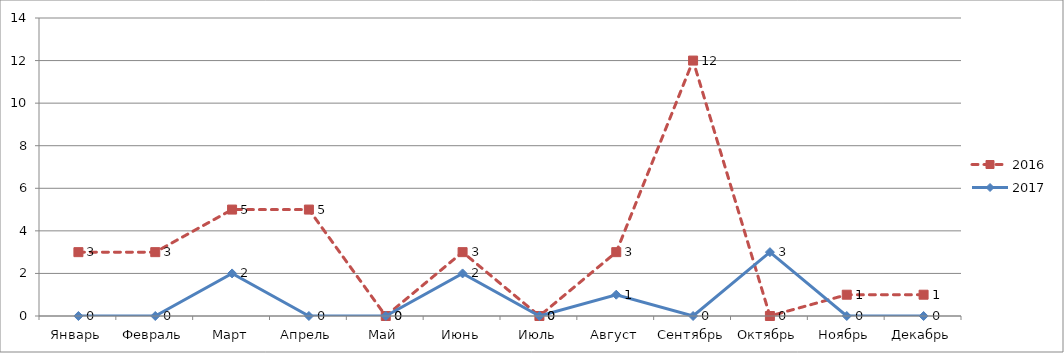
| Category | 2016 | 2017 |
|---|---|---|
| Январь | 3 | 0 |
| Февраль | 3 | 0 |
| Март | 5 | 2 |
| Апрель | 5 | 0 |
| Май | 0 | 0 |
| Июнь | 3 | 2 |
| Июль | 0 | 0 |
| Август | 3 | 1 |
| Сентябрь | 12 | 0 |
| Октябрь | 0 | 3 |
| Ноябрь | 1 | 0 |
| Декабрь | 1 | 0 |